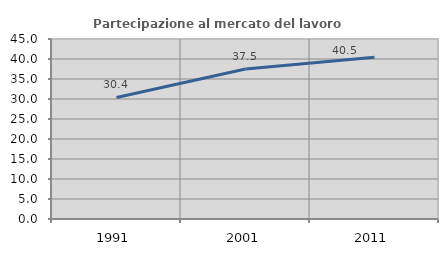
| Category | Partecipazione al mercato del lavoro  femminile |
|---|---|
| 1991.0 | 30.391 |
| 2001.0 | 37.491 |
| 2011.0 | 40.465 |